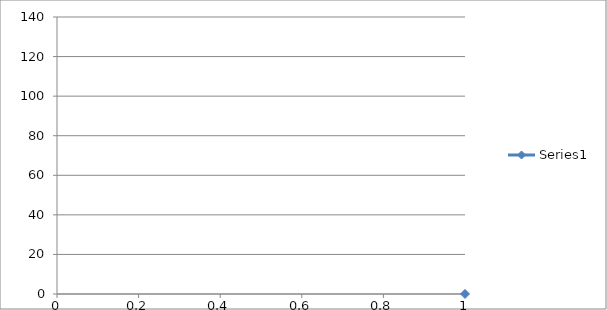
| Category | Series 0 |
|---|---|
| 0 | 0.015 |
| 1 | 0.039 |
| 2 | 0.063 |
| 3 | 0.065 |
| 4 | 0.088 |
| 5 | 0.084 |
| 6 | 0.11 |
| 7 | 0.104 |
| 8 | 0.102 |
| 9 | 0.122 |
| 10 | 0.132 |
| 11 | 0.161 |
| 12 | 0.193 |
| 13 | 0.191 |
| 14 | 0.238 |
| 15 | 0.256 |
| 16 | 0.305 |
| 17 | 0.384 |
| 18 | 0.453 |
| 19 | 0.524 |
| 20 | 0.611 |
| 21 | 0.735 |
| 22 | 0.858 |
| 23 | 1.04 |
| 24 | 1.259 |
| 25 | 1.553 |
| 26 | 1.9 |
| 27 | 2.355 |
| 28 | 2.969 |
| 29 | 3.718 |
| 30 | 5.225 |
| 31 | 5.632 |
| 32 | 6.277 |
| 33 | 6.849 |
| 34 | 8.189 |
| 35 | 8.758 |
| 36 | 10.105 |
| 37 | 11.291 |
| 38 | 12.562 |
| 39 | 13.959 |
| 40 | 15.559 |
| 41 | 17.183 |
| 42 | 19.609 |
| 43 | 21.521 |
| 44 | 24.12 |
| 45 | 27.197 |
| 46 | 30.218 |
| 47 | 33.33 |
| 48 | 37.44 |
| 49 | 41.415 |
| 50 | 45.622 |
| 51 | 50.291 |
| 52 | 54.957 |
| 53 | 59.249 |
| 54 | 64.547 |
| 55 | 69.121 |
| 56 | 74.492 |
| 57 | 79.037 |
| 58 | 84.197 |
| 59 | 88.688 |
| 60 | 93.05 |
| 61 | 96.99 |
| 62 | 100.625 |
| 63 | 103.701 |
| 64 | 106.841 |
| 65 | 109.534 |
| 66 | 112.18 |
| 67 | 113.957 |
| 68 | 115.597 |
| 69 | 117.248 |
| 70 | 118.656 |
| 71 | 119.253 |
| 72 | 120.071 |
| 73 | 120.638 |
| 74 | 121.187 |
| 75 | 121.513 |
| 76 | 121.766 |
| 77 | 121.954 |
| 78 | 122.027 |
| 79 | 122.055 |
| 80 | 122.049 |
| 81 | 121.994 |
| 82 | 121.926 |
| 83 | 121.829 |
| 84 | 121.675 |
| 85 | 121.454 |
| 86 | 121.193 |
| 87 | 120.764 |
| 88 | 120.322 |
| 89 | 119.687 |
| 90 | 118.313 |
| 91 | 117.049 |
| 92 | 115.649 |
| 93 | 114.154 |
| 94 | 111.776 |
| 95 | 109.847 |
| 96 | 107.059 |
| 97 | 104.113 |
| 98 | 100.825 |
| 99 | 96.778 |
| 100 | 92.716 |
| 101 | 88.571 |
| 102 | 84.22 |
| 103 | 79.321 |
| 104 | 74.966 |
| 105 | 70.095 |
| 106 | 64.733 |
| 107 | 59.818 |
| 108 | 55.34 |
| 109 | 50.343 |
| 110 | 46.173 |
| 111 | 42.02 |
| 112 | 37.839 |
| 113 | 34.573 |
| 114 | 30.605 |
| 115 | 27.749 |
| 116 | 25.025 |
| 117 | 22.339 |
| 118 | 20.345 |
| 119 | 17.779 |
| 120 | 16.28 |
| 121 | 14.661 |
| 122 | 13.093 |
| 123 | 11.613 |
| 124 | 10.289 |
| 125 | 9.703 |
| 126 | 8.37 |
| 127 | 7.895 |
| 128 | 7.26 |
| 129 | 6.632 |
| 130 | 6.02 |
| 131 | 4.524 |
| 132 | 3.874 |
| 133 | 3.212 |
| 134 | 2.595 |
| 135 | 2.15 |
| 136 | 1.769 |
| 137 | 1.46 |
| 138 | 1.221 |
| 139 | 1.058 |
| 140 | 0.903 |
| 141 | 0.802 |
| 142 | 0.715 |
| 143 | 0.633 |
| 144 | 0.571 |
| 145 | 0.505 |
| 146 | 0.474 |
| 147 | 0.438 |
| 148 | 0.413 |
| 149 | 0.392 |
| 150 | 0.392 |
| 151 | 0.36 |
| 152 | 0.338 |
| 153 | 0.332 |
| 154 | 0.316 |
| 155 | 0.302 |
| 156 | 0.303 |
| 157 | 0.315 |
| 158 | 0.32 |
| 159 | 0.32 |
| 160 | 0.283 |